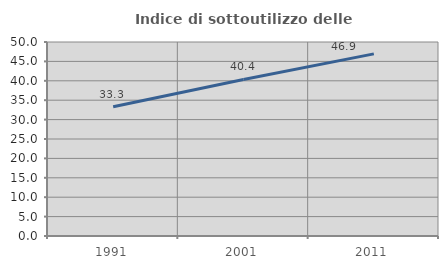
| Category | Indice di sottoutilizzo delle abitazioni  |
|---|---|
| 1991.0 | 33.333 |
| 2001.0 | 40.351 |
| 2011.0 | 46.939 |